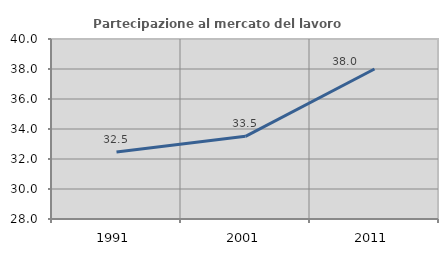
| Category | Partecipazione al mercato del lavoro  femminile |
|---|---|
| 1991.0 | 32.472 |
| 2001.0 | 33.512 |
| 2011.0 | 38.002 |